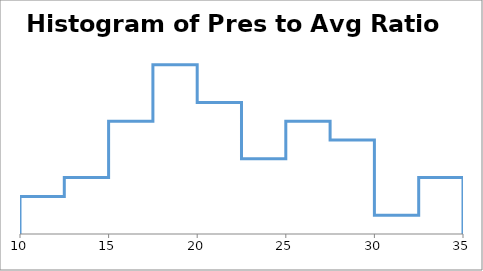
| Category | Series 0 |
|---|---|
| 10.0 | 0 |
| 10.0 | 2 |
| 12.5 | 2 |
| 12.5 | 3 |
| 15.0 | 3 |
| 15.0 | 6 |
| 17.5 | 6 |
| 17.5 | 9 |
| 20.0 | 9 |
| 20.0 | 7 |
| 22.5 | 7 |
| 22.5 | 4 |
| 25.0 | 4 |
| 25.0 | 6 |
| 27.5 | 6 |
| 27.5 | 5 |
| 30.0 | 5 |
| 30.0 | 1 |
| 32.5 | 1 |
| 32.5 | 3 |
| 35.0 | 3 |
| 35.0 | 0 |